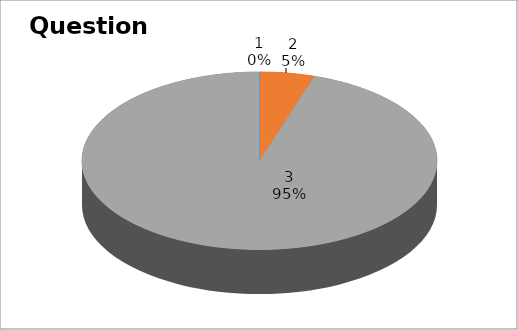
| Category | Series 0 |
|---|---|
| 0 | 0 |
| 1 | 3 |
| 2 | 57 |